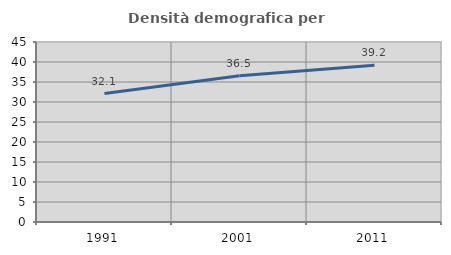
| Category | Densità demografica |
|---|---|
| 1991.0 | 32.122 |
| 2001.0 | 36.541 |
| 2011.0 | 39.168 |